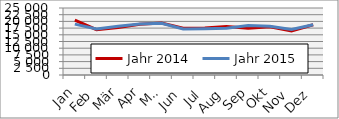
| Category | Jahr 2014 | Jahr 2015 |
|---|---|---|
| Jan | 20511.518 | 18984.091 |
| Feb | 16930.516 | 17148.136 |
| Mär | 17709.604 | 18180.701 |
| Apr | 18952.005 | 19046.426 |
| Mai | 19397.52 | 19320.424 |
| Jun | 17485.14 | 17191.153 |
| Jul | 17501.553 | 17302.793 |
| Aug | 18124.953 | 17466.004 |
| Sep | 17487.606 | 18425.665 |
| Okt | 17963.811 | 18167.716 |
| Nov | 16437.987 | 16994.304 |
| Dez | 18734.205 | 18766.347 |